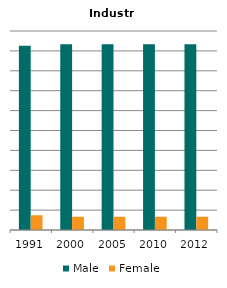
| Category | Male | Female |
|---|---|---|
| 1991.0 | 0.926 | 0.074 |
| 2000.0 | 0.934 | 0.066 |
| 2005.0 | 0.934 | 0.066 |
| 2010.0 | 0.933 | 0.067 |
| 2012.0 | 0.933 | 0.067 |